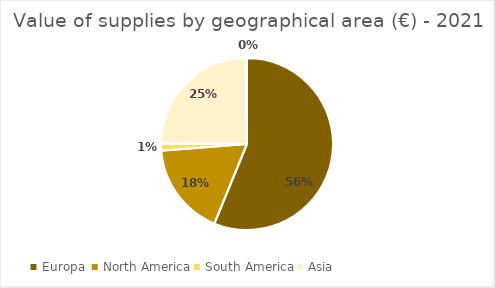
| Category | Series 0 |
|---|---|
| Europa  | 1013421592 |
| North America | 316636567 |
| South America | 25848759 |
| Asia | 444685424 |
| Other countries* | 2895877 |